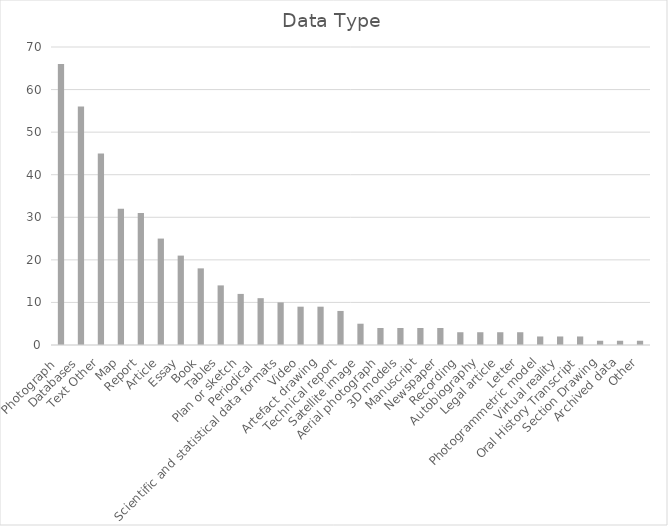
| Category | Number |
|---|---|
| Photograph  | 66 |
| Databases | 56 |
| Text Other | 45 |
| Map | 32 |
| Report | 31 |
| Article | 25 |
| Essay | 21 |
| Book | 18 |
| Tables | 14 |
| Plan or sketch | 12 |
| Periodical  | 11 |
| Scientific and statistical data formats | 10 |
| Video | 9 |
| Artefact drawing | 9 |
| Technical report | 8 |
| Satellite image | 5 |
| Aerial photograph | 4 |
| 3D models | 4 |
| Manuscript | 4 |
| Newspaper | 4 |
| Recording | 3 |
| Autobiography | 3 |
| Legal article | 3 |
| Letter | 3 |
| Photogrammetric model | 2 |
| Virtual reality | 2 |
| Oral History Transcript | 2 |
| Section Drawing | 1 |
| Archived data | 1 |
| Other | 1 |